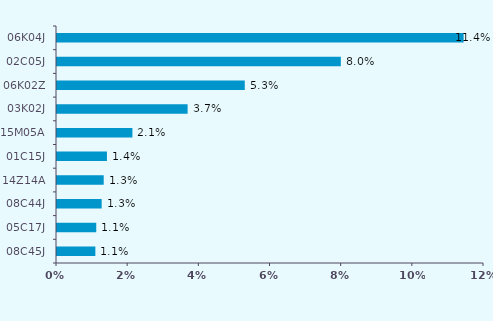
| Category | Series 0 |
|---|---|
| 08C45J | 0.011 |
| 05C17J | 0.011 |
| 08C44J | 0.013 |
| 14Z14A | 0.013 |
| 01C15J | 0.014 |
| 15M05A | 0.021 |
| 03K02J | 0.037 |
| 06K02Z | 0.053 |
| 02C05J | 0.08 |
| 06K04J | 0.114 |